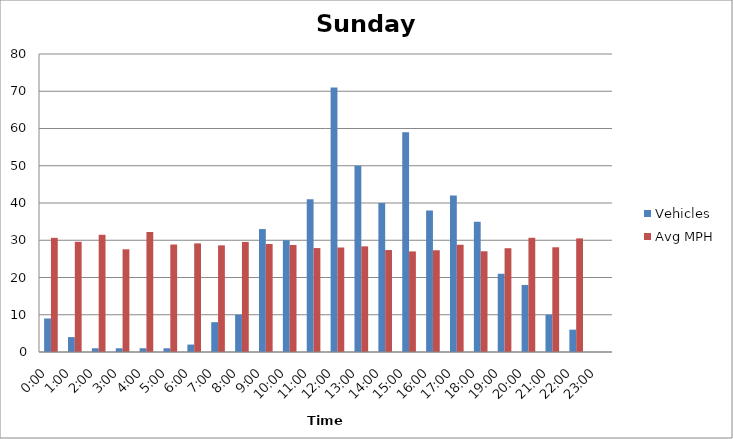
| Category | Vehicles | Avg MPH |
|---|---|---|
| 0:00 | 9 | 30.65 |
| 1:00 | 4 | 29.59 |
| 2:00 | 1 | 31.47 |
| 3:00 | 1 | 27.57 |
| 4:00 | 1 | 32.22 |
| 5:00 | 1 | 28.85 |
| 6:00 | 2 | 29.16 |
| 7:00 | 8 | 28.63 |
| 8:00 | 10 | 29.54 |
| 9:00 | 33 | 28.99 |
| 10:00 | 30 | 28.72 |
| 11:00 | 41 | 27.9 |
| 12:00 | 71 | 28.05 |
| 13:00 | 50 | 28.36 |
| 14:00 | 40 | 27.37 |
| 15:00 | 59 | 27 |
| 16:00 | 38 | 27.31 |
| 17:00 | 42 | 28.79 |
| 18:00 | 35 | 27.04 |
| 19:00 | 21 | 27.86 |
| 20:00 | 18 | 30.66 |
| 21:00 | 10 | 28.11 |
| 22:00 | 6 | 30.5 |
| 23:00 | 0 | 0 |